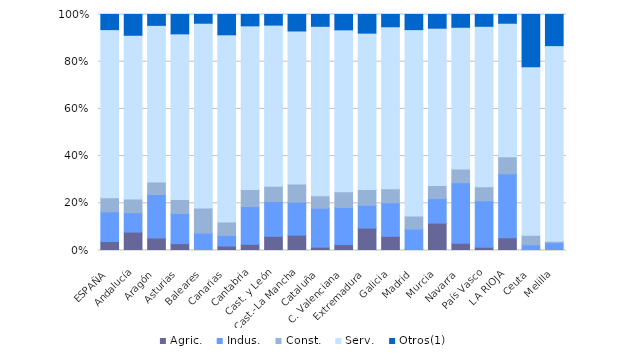
| Category | Agric. | Indus. | Const. | Serv. | Otros(1) |
|---|---|---|---|---|---|
| ESPAÑA | 3.8 | 12.6 | 6 | 71.2 | 6.4 |
| Andalucía | 7.8 | 8.2 | 5.8 | 69.4 | 8.8 |
| Aragón | 5.3 | 18.4 | 5.3 | 66.3 | 4.6 |
| Asturias | 2.9 | 12.8 | 5.9 | 70.2 | 8.2 |
| Baleares | 0.2 | 7.2 | 10.6 | 78.3 | 3.7 |
| Canarias | 1.9 | 4.5 | 5.7 | 79.3 | 8.6 |
| Cantabria | 2.6 | 16 | 7.2 | 69.3 | 4.8 |
| Cast. y León | 6 | 14.8 | 6.4 | 68.4 | 4.5 |
| Cast.-La Mancha | 6.5 | 14 | 7.7 | 64.9 | 7 |
| Cataluña | 1.4 | 16.5 | 5.3 | 71.8 | 5 |
| C. Valenciana | 2.5 | 15.7 | 6.7 | 68.5 | 6.5 |
| Extremadura | 9.5 | 9.7 | 6.6 | 66.3 | 7.9 |
| Galicia | 6 | 14.2 | 6 | 68.7 | 5.2 |
| Madrid | 0.4 | 8.7 | 5.5 | 79 | 6.4 |
| Murcia | 11.6 | 10.4 | 5.5 | 66.7 | 5.8 |
| Navarra | 3.1 | 25.6 | 5.8 | 60 | 5.4 |
| País Vasco | 1.4 | 19.7 | 5.9 | 68.1 | 5 |
| LA RIOJA | 5.4 | 27.1 | 7.2 | 56.6 | 3.7 |
| Ceuta | 0.4 | 2 | 4.1 | 71.4 | 22.2 |
| Melilla | 0 | 3.3 | 0.6 | 83 | 13.2 |